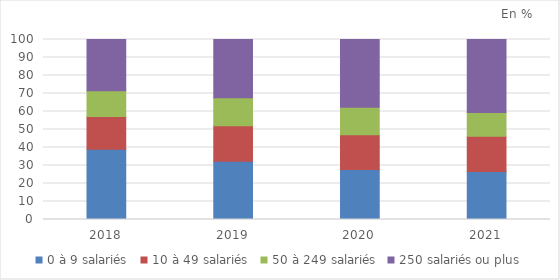
| Category | 0 à 9 salariés  | 10 à 49 salariés  | 50 à 249 salariés  | 250 salariés ou plus |
|---|---|---|---|---|
| 2018.0 | 39 | 18.2 | 14.3 | 28.5 |
| 2019.0 | 32.3 | 19.8 | 15.6 | 32.3 |
| 2020.0 | 27.8 | 19.3 | 15.2 | 37.7 |
| 2021.0 | 26.6 | 19.7 | 13.2 | 40.5 |